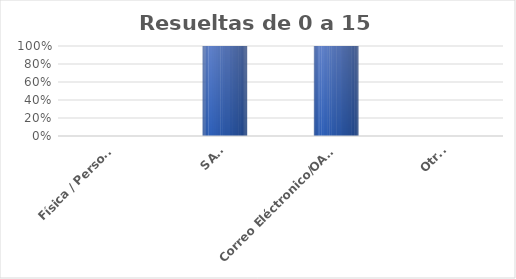
| Category | Series 0 |
|---|---|
| Física / Personal | 0 |
| SAIP | 6 |
| Correo Eléctronico/OAI/Info/Contacto | 9 |
| Otras | 0 |